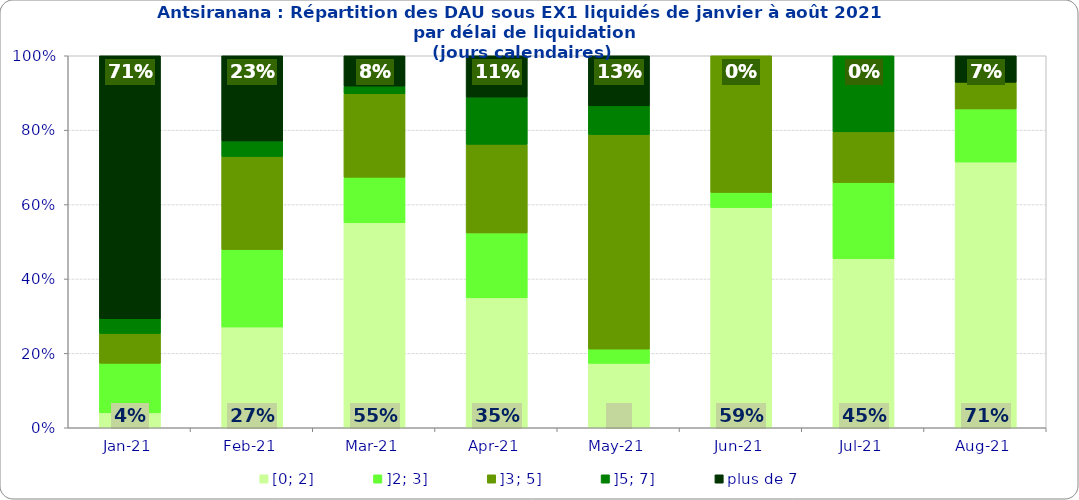
| Category | [0; 2] | ]2; 3] | ]3; 5] | ]5; 7] | plus de 7 |
|---|---|---|---|---|---|
| 2021-01-01 | 0.04 | 0.133 | 0.08 | 0.04 | 0.707 |
| 2021-02-01 | 0.271 | 0.208 | 0.25 | 0.042 | 0.229 |
| 2021-03-01 | 0.551 | 0.122 | 0.224 | 0.02 | 0.082 |
| 2021-04-01 | 0.349 | 0.175 | 0.238 | 0.127 | 0.111 |
| 2021-05-01 | 0.173 | 0.038 | 0.577 | 0.077 | 0.135 |
| 2021-06-01 | 0.592 | 0.041 | 0.367 | 0 | 0 |
| 2021-07-01 | 0.455 | 0.205 | 0.136 | 0.205 | 0 |
| 2021-08-01 | 0.714 | 0.143 | 0.071 | 0 | 0.071 |